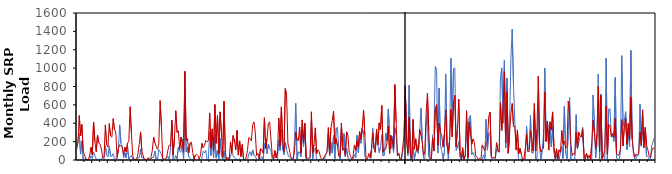
| Category | Observed (kg/month) | Baseline calibrated (kg/month) |
|---|---|---|
| 1984-01-01 | 108.048 | 135.9 |
| 1984-02-01 | 216.39 | 187 |
| 1984-03-01 | 294.928 | 484.6 |
| 1984-04-01 | 64.198 | 263.6 |
| 1984-05-01 | 207.227 | 386 |
| 1984-06-01 | 8.047 | 93.82 |
| 1984-07-01 | 5.303 | 59.36 |
| 1984-08-01 | 17.606 | 4.059 |
| 1984-09-01 | 7.118 | 3.465 |
| 1984-10-01 | 4.924 | 1.896 |
| 1984-11-01 | 4.593 | 49.46 |
| 1984-12-01 | 45.871 | 139.2 |
| 1985-01-01 | 16.212 | 55.19 |
| 1985-02-01 | 86.905 | 414 |
| 1985-03-01 | 47.809 | 199.6 |
| 1985-04-01 | 8.195 | 89.16 |
| 1985-05-01 | 8.622 | 271.1 |
| 1985-06-01 | 3.564 | 188.7 |
| 1985-07-01 | 8.514 | 166.3 |
| 1985-08-01 | 11.326 | 119.3 |
| 1985-09-01 | 9.684 | 20.19 |
| 1985-10-01 | 7.808 | 38.03 |
| 1985-11-01 | 155.088 | 381.9 |
| 1985-12-01 | 54.306 | 164.9 |
| 1986-01-01 | 32.9 | 140.7 |
| 1986-02-01 | 150.128 | 395.4 |
| 1986-03-01 | 40.3 | 261.1 |
| 1986-04-01 | 41.448 | 249.3 |
| 1986-05-01 | 69.764 | 450.2 |
| 1986-06-01 | 16.77 | 331 |
| 1986-07-01 | 23.451 | 304.3 |
| 1986-08-01 | 10.859 | 31.16 |
| 1986-09-01 | 115.216 | 125.1 |
| 1986-10-01 | 382.571 | 165.5 |
| 1986-11-01 | 177.652 | 151.8 |
| 1986-12-01 | 152.502 | 131.7 |
| 1987-01-01 | 26.45 | 60.33 |
| 1987-02-01 | 77.159 | 137.8 |
| 1987-03-01 | 21.367 | 90.11 |
| 1987-04-01 | 147.656 | 183.1 |
| 1987-05-01 | 10.481 | 204.5 |
| 1987-06-01 | 34.903 | 580.4 |
| 1987-07-01 | 48.638 | 287.4 |
| 1987-08-01 | 9.65 | 46.54 |
| 1987-09-01 | 5.763 | 5.593 |
| 1987-10-01 | 6.504 | 6.366 |
| 1987-11-01 | 4.396 | 7.368 |
| 1987-12-01 | 25.474 | 67.75 |
| 1988-01-01 | 24.74 | 170.3 |
| 1988-02-01 | 115.843 | 306.6 |
| 1988-03-01 | 25.402 | 97.17 |
| 1988-04-01 | 30.733 | 47.59 |
| 1988-05-01 | 1.336 | 3.434 |
| 1988-06-01 | 4.697 | 0.273 |
| 1988-07-01 | 4.204 | 10.87 |
| 1988-08-01 | 12.739 | 25.03 |
| 1988-09-01 | 2.21 | 5.664 |
| 1988-10-01 | 6.324 | 28.38 |
| 1988-11-01 | 29.064 | 103.4 |
| 1988-12-01 | 25.99 | 249.6 |
| 1989-01-01 | 97.28 | 185.7 |
| 1989-02-01 | 5.523 | 149.6 |
| 1989-03-01 | 8.506 | 116.2 |
| 1989-04-01 | 113.306 | 171.2 |
| 1989-05-01 | 92.401 | 646.8 |
| 1989-06-01 | 58.739 | 369.9 |
| 1989-07-01 | 11.434 | 22.36 |
| 1989-08-01 | 1.772 | 3.503 |
| 1989-09-01 | 2.798 | 14.02 |
| 1989-10-01 | 20.788 | 28.5 |
| 1989-11-01 | 38.262 | 108.4 |
| 1989-12-01 | 8.852 | 161.5 |
| 1990-01-01 | 118.282 | 152.7 |
| 1990-02-01 | 396.539 | 434.9 |
| 1990-03-01 | 11.19 | 56.69 |
| 1990-04-01 | 6.731 | 235.1 |
| 1990-05-01 | 49.139 | 536.5 |
| 1990-06-01 | 12.41 | 300.1 |
| 1990-07-01 | 137.158 | 318.5 |
| 1990-08-01 | 97.605 | 118.5 |
| 1990-09-01 | 83.53 | 250.1 |
| 1990-10-01 | 226.531 | 188.3 |
| 1990-11-01 | 6.834 | 85.06 |
| 1990-12-01 | 643.886 | 965.3 |
| 1991-01-01 | 86.483 | 207.4 |
| 1991-02-01 | 137.664 | 233.7 |
| 1991-03-01 | 29.412 | 77.04 |
| 1991-04-01 | 19.83 | 184.5 |
| 1991-05-01 | 5.333 | 194.4 |
| 1991-06-01 | 5.635 | 82.84 |
| 1991-07-01 | 3.546 | 6.62 |
| 1991-08-01 | 4.541 | 53.85 |
| 1991-09-01 | 2.308 | 62.58 |
| 1991-10-01 | 2.427 | 48.42 |
| 1991-11-01 | 1.673 | 8.192 |
| 1991-12-01 | 1.274 | 55.44 |
| 1992-01-01 | 17.896 | 181.6 |
| 1992-02-01 | 95.815 | 134 |
| 1992-03-01 | 75.682 | 157.5 |
| 1992-04-01 | 105.802 | 213.7 |
| 1992-05-01 | 4.631 | 198 |
| 1992-06-01 | 10.257 | 210.6 |
| 1992-07-01 | 309.127 | 512.9 |
| 1992-08-01 | 49.822 | 128.1 |
| 1992-09-01 | 303.124 | 338.6 |
| 1992-10-01 | 28.169 | 100.9 |
| 1992-11-01 | 275.04 | 604 |
| 1992-12-01 | 20.181 | 181.3 |
| 1993-01-01 | 106.071 | 483.4 |
| 1993-02-01 | 7.727 | 70.81 |
| 1993-03-01 | 234.616 | 524.1 |
| 1993-04-01 | 57.076 | 298.7 |
| 1993-05-01 | 0.72 | 35.48 |
| 1993-06-01 | 96.05 | 639.6 |
| 1993-07-01 | 9.66 | 86.04 |
| 1993-08-01 | 2.242 | 3.163 |
| 1993-09-01 | 1.398 | 30.03 |
| 1993-10-01 | 2.323 | 6.198 |
| 1993-11-01 | 42.304 | 197.5 |
| 1993-12-01 | 80.767 | 78.4 |
| 1994-01-01 | 48.385 | 266.1 |
| 1994-02-01 | 22.905 | 205.6 |
| 1994-03-01 | 9.444 | 109.7 |
| 1994-04-01 | 10.566 | 321.7 |
| 1994-05-01 | 0 | 52.86 |
| 1994-06-01 | 17.198 | 208.1 |
| 1994-07-01 | 2.049 | 36.93 |
| 1994-08-01 | 6.271 | 168.9 |
| 1994-09-01 | 1.894 | 2.074 |
| 1994-10-01 | 4.006 | 0.282 |
| 1994-11-01 | 2.637 | 28.34 |
| 1994-12-01 | 2.018 | 105.3 |
| 1995-01-01 | 65.525 | 243.9 |
| 1995-02-01 | 89.851 | 235.9 |
| 1995-03-01 | 44.718 | 208.2 |
| 1995-04-01 | 109.999 | 384.9 |
| 1995-05-01 | 51.345 | 415.2 |
| 1995-06-01 | 42.493 | 297.9 |
| 1995-07-01 | 7.709 | 47.29 |
| 1995-08-01 | 4.95 | 74.57 |
| 1995-09-01 | 0.82 | 1.668 |
| 1995-10-01 | 11.913 | 124 |
| 1995-11-01 | 35.714 | 109.8 |
| 1995-12-01 | 0.619 | 74.53 |
| 1996-01-01 | 179.914 | 459.6 |
| 1996-02-01 | 195.743 | 125.7 |
| 1996-03-01 | 68.605 | 235.9 |
| 1996-04-01 | 170.995 | 396.6 |
| 1996-05-01 | 125.428 | 415.3 |
| 1996-06-01 | 101.509 | 226.9 |
| 1996-07-01 | 1.794 | 54.02 |
| 1996-08-01 | 1.026 | 7.633 |
| 1996-09-01 | 0.969 | 102.2 |
| 1996-10-01 | 0.251 | 22.77 |
| 1996-11-01 | 1.953 | 88.83 |
| 1996-12-01 | 216.486 | 456.7 |
| 1997-01-01 | 103.103 | 148.6 |
| 1997-02-01 | 336.816 | 578.1 |
| 1997-03-01 | 114.536 | 205.8 |
| 1997-04-01 | 57.273 | 87.74 |
| 1997-05-01 | 194.686 | 778.1 |
| 1997-06-01 | 113.932 | 703.4 |
| 1997-07-01 | 57.085 | 174.7 |
| 1997-08-01 | 31.687 | 124.4 |
| 1997-09-01 | 24.325 | 42.2 |
| 1997-10-01 | 2.005 | 12.59 |
| 1997-11-01 | 9.142 | 12.97 |
| 1997-12-01 | 187.759 | 83.17 |
| 1998-01-01 | 617.114 | 306.4 |
| 1998-02-01 | 5.892 | 217.9 |
| 1998-03-01 | 86.87 | 211.4 |
| 1998-04-01 | 86.199 | 357.6 |
| 1998-05-01 | 35.61 | 75.91 |
| 1998-06-01 | 327.342 | 436 |
| 1998-07-01 | 145.986 | 190.6 |
| 1998-08-01 | 333.127 | 400.6 |
| 1998-09-01 | 2.341 | 26.1 |
| 1998-10-01 | 0.655 | 18.21 |
| 1998-11-01 | 1.225 | 20.77 |
| 1998-12-01 | 0.836 | 35.86 |
| 1999-01-01 | 419.578 | 525 |
| 1999-02-01 | 10.884 | 81.07 |
| 1999-03-01 | 112.747 | 169.7 |
| 1999-04-01 | 129.775 | 350 |
| 1999-05-01 | 2.535 | 67.35 |
| 1999-06-01 | 4.107 | 110.1 |
| 1999-07-01 | 8.026 | 92.87 |
| 1999-08-01 | 5.76 | 29.5 |
| 1999-09-01 | 2.939 | 6.174 |
| 1999-10-01 | 2.101 | 10.53 |
| 1999-11-01 | 2.25 | 42.46 |
| 1999-12-01 | 56.072 | 61.37 |
| 2000-01-01 | 87.264 | 89.04 |
| 2000-02-01 | 296.438 | 353.1 |
| 2000-03-01 | 43.938 | 62.79 |
| 2000-04-01 | 189.142 | 347.5 |
| 2000-05-01 | 74.512 | 430 |
| 2000-06-01 | 269.388 | 530.6 |
| 2000-07-01 | 14.505 | 176.7 |
| 2000-08-01 | 345.023 | 232.3 |
| 2000-09-01 | 355.642 | 153 |
| 2000-10-01 | 130.954 | 40.44 |
| 2000-11-01 | 4.646 | 39.55 |
| 2000-12-01 | 341.447 | 401.2 |
| 2001-01-01 | 97.799 | 114 |
| 2001-02-01 | 286.617 | 130 |
| 2001-03-01 | 37.502 | 48.57 |
| 2001-04-01 | 129.98 | 306.5 |
| 2001-05-01 | 25.652 | 268.3 |
| 2001-06-01 | 10.293 | 82.94 |
| 2001-07-01 | 3.379 | 40.16 |
| 2001-08-01 | 7.077 | 5.377 |
| 2001-09-01 | 2.654 | 43.09 |
| 2001-10-01 | 58.732 | 164.3 |
| 2001-11-01 | 25.232 | 107.2 |
| 2001-12-01 | 266.961 | 204.1 |
| 2002-01-01 | 82.396 | 148 |
| 2002-02-01 | 230.058 | 308.5 |
| 2002-03-01 | 182.048 | 225.2 |
| 2002-04-01 | 337.045 | 355.3 |
| 2002-05-01 | 292.91 | 544.7 |
| 2002-06-01 | 41.472 | 270.6 |
| 2002-07-01 | 2.936 | 4.125 |
| 2002-08-01 | 4.854 | 11.28 |
| 2002-09-01 | 5.731 | 70.55 |
| 2002-10-01 | 2.747 | 25.56 |
| 2002-11-01 | 25.732 | 109.2 |
| 2002-12-01 | 343.991 | 295.1 |
| 2003-01-01 | 131.254 | 128.3 |
| 2003-02-01 | 129.353 | 83.57 |
| 2003-03-01 | 287.804 | 334 |
| 2003-04-01 | 163.033 | 167.2 |
| 2003-05-01 | 80.265 | 404.1 |
| 2003-06-01 | 138.758 | 330.3 |
| 2003-07-01 | 274.361 | 592.6 |
| 2003-08-01 | 45.613 | 84.84 |
| 2003-09-01 | 50.596 | 117 |
| 2003-10-01 | 293.092 | 118.6 |
| 2003-11-01 | 209.705 | 186.3 |
| 2003-12-01 | 556.546 | 368.3 |
| 2004-01-01 | 290.341 | 70.95 |
| 2004-02-01 | 124.641 | 267.6 |
| 2004-03-01 | 254.19 | 207.9 |
| 2004-04-01 | 82.878 | 122.7 |
| 2004-05-01 | 350.484 | 820.8 |
| 2004-06-01 | 276.449 | 414.7 |
| 2004-07-01 | 46.086 | 47.32 |
| 2004-08-01 | 63.524 | 76.55 |
| 2004-09-01 | 3.097 | 10.22 |
| 2004-10-01 | 2.628 | 10.6 |
| 2004-11-01 | 89.18 | 134.4 |
| 2004-12-01 | 176.158 | 267.9 |
| 2005-01-01 | 753.418 | 807.2 |
| 2005-02-01 | 274.582 | 195.3 |
| 2005-03-01 | 48.433 | 75.92 |
| 2005-04-01 | 814.747 | 467.1 |
| 2005-05-01 | 5.586 | 59.03 |
| 2005-06-01 | 4.75 | 4.256 |
| 2005-07-01 | 146.586 | 441.1 |
| 2005-08-01 | 13.657 | 117.8 |
| 2005-09-01 | 80.189 | 230.9 |
| 2005-10-01 | 165.116 | 94.71 |
| 2005-11-01 | 72.857 | 109.1 |
| 2005-12-01 | 272.198 | 330.4 |
| 2006-01-01 | 564.193 | 272 |
| 2006-02-01 | 219.671 | 199.1 |
| 2006-03-01 | 20.928 | 53.64 |
| 2006-04-01 | 3.38 | 87.61 |
| 2006-05-01 | 354.306 | 514.8 |
| 2006-06-01 | 551.727 | 728.5 |
| 2006-07-01 | 43.36 | 320.9 |
| 2006-08-01 | 5.076 | 20.56 |
| 2006-09-01 | 2.96 | 16.75 |
| 2006-10-01 | 276.41 | 243.1 |
| 2006-11-01 | 291.066 | 96.9 |
| 2006-12-01 | 1016.955 | 556.8 |
| 2007-01-01 | 982.65 | 603.1 |
| 2007-02-01 | 77.711 | 159.9 |
| 2007-03-01 | 783.538 | 401.5 |
| 2007-04-01 | 155.234 | 300.7 |
| 2007-05-01 | 102.01 | 265.2 |
| 2007-06-01 | 10.898 | 139.7 |
| 2007-07-01 | 83.407 | 285.6 |
| 2007-08-01 | 936.771 | 546.1 |
| 2007-09-01 | 222.943 | 156 |
| 2007-10-01 | 7.339 | 72.15 |
| 2007-11-01 | 233.2 | 212.2 |
| 2007-12-01 | 1106.851 | 548.2 |
| 2008-01-01 | 420.581 | 252 |
| 2008-02-01 | 994.323 | 628 |
| 2008-03-01 | 1002.733 | 703.9 |
| 2008-04-01 | 103.476 | 142.6 |
| 2008-05-01 | 141.861 | 331.7 |
| 2008-06-01 | 201.143 | 662.1 |
| 2008-07-01 | 33.931 | 103 |
| 2008-08-01 | 2.884 | 3.027 |
| 2008-09-01 | 58.407 | 133.3 |
| 2008-10-01 | 3.25 | 10.74 |
| 2008-11-01 | 52.517 | 48.72 |
| 2008-12-01 | 433.378 | 536.3 |
| 2009-01-01 | 6.941 | 30.63 |
| 2009-02-01 | 455.413 | 412.2 |
| 2009-03-01 | 489.569 | 295.3 |
| 2009-04-01 | 59.773 | 170.4 |
| 2009-05-01 | 82.105 | 229.5 |
| 2009-06-01 | 46.746 | 192.8 |
| 2009-07-01 | 3.439 | 43.92 |
| 2009-08-01 | 4.269 | 32.25 |
| 2009-09-01 | 2.469 | 5.699 |
| 2009-10-01 | 3.131 | 17.43 |
| 2009-11-01 | 2.093 | 2.745 |
| 2009-12-01 | 11.942 | 164.2 |
| 2010-01-01 | 55.731 | 131.1 |
| 2010-02-01 | 2.968 | 100.9 |
| 2010-03-01 | 442.31 | 166.1 |
| 2010-04-01 | 107.638 | 203.9 |
| 2010-05-01 | 287.966 | 472.6 |
| 2010-06-01 | 302.528 | 522.2 |
| 2010-07-01 | 14.729 | 40.54 |
| 2010-08-01 | 14.105 | 20.78 |
| 2010-09-01 | 4.484 | 27.14 |
| 2010-10-01 | 4.926 | 24.54 |
| 2010-11-01 | 117.814 | 187.9 |
| 2010-12-01 | 90.645 | 102.9 |
| 2011-01-01 | 90.034 | 83.78 |
| 2011-02-01 | 897.176 | 625.5 |
| 2011-03-01 | 1003.138 | 321.6 |
| 2011-04-01 | 401.111 | 560.1 |
| 2011-05-01 | 1082.677 | 962.4 |
| 2011-06-01 | 130.043 | 184.9 |
| 2011-07-01 | 892.493 | 741.6 |
| 2011-08-01 | 70.242 | 79.31 |
| 2011-09-01 | 404.987 | 286.9 |
| 2011-10-01 | 1107.212 | 507 |
| 2011-11-01 | 1423.827 | 614.7 |
| 2011-12-01 | 808.576 | 364.2 |
| 2012-01-01 | 423.997 | 366.7 |
| 2012-02-01 | 135.269 | 107.7 |
| 2012-03-01 | 137.536 | 327.5 |
| 2012-04-01 | 2.761 | 67.32 |
| 2012-05-01 | 6.76 | 126.2 |
| 2012-06-01 | 9.333 | 61.75 |
| 2012-07-01 | 9.313 | 5.554 |
| 2012-08-01 | 5.751 | 10.79 |
| 2012-09-01 | 7.133 | 119.6 |
| 2012-10-01 | 370.468 | 275.6 |
| 2012-11-01 | 138.06 | 91.34 |
| 2012-12-01 | 119.799 | 91.13 |
| 2013-01-01 | 483.192 | 324.2 |
| 2013-02-01 | 79.624 | 232.5 |
| 2013-03-01 | 71.896 | 99.16 |
| 2013-04-01 | 512.438 | 613.7 |
| 2013-05-01 | 8.523 | 96.65 |
| 2013-06-01 | 12.122 | 335.1 |
| 2013-07-01 | 598.537 | 913.2 |
| 2013-08-01 | 132.511 | 190.1 |
| 2013-09-01 | 3.376 | 87.68 |
| 2013-10-01 | 106.902 | 112.4 |
| 2013-11-01 | 276.6 | 127.3 |
| 2013-12-01 | 1000.055 | 737.5 |
| 2014-01-01 | 200.336 | 204.9 |
| 2014-02-01 | 425.225 | 418.9 |
| 2014-03-01 | 176.173 | 107.8 |
| 2014-04-01 | 373.378 | 415.7 |
| 2014-05-01 | 141.7 | 325.7 |
| 2014-06-01 | 364.955 | 523.4 |
| 2014-07-01 | 85.646 | 148.4 |
| 2014-08-01 | 3.228 | 16.21 |
| 2014-09-01 | 50.271 | 121.6 |
| 2014-10-01 | 5.616 | 11.41 |
| 2014-11-01 | 10.043 | 110.9 |
| 2014-12-01 | 75.347 | 85.34 |
| 2015-01-01 | 153.159 | 321 |
| 2015-02-01 | 17.15 | 169.6 |
| 2015-03-01 | 584.874 | 206.9 |
| 2015-04-01 | 77.105 | 127.8 |
| 2015-05-01 | 13.039 | 139 |
| 2015-06-01 | 307.394 | 642 |
| 2015-07-01 | 678.588 | 501.8 |
| 2015-08-01 | 3.378 | 170.6 |
| 2015-09-01 | 3.947 | 45.08 |
| 2015-10-01 | 10.464 | 75.83 |
| 2015-11-01 | 6.825 | 59.38 |
| 2015-12-01 | 494.852 | 300.7 |
| 2016-01-01 | 123.581 | 132.4 |
| 2016-02-01 | 185.213 | 302.1 |
| 2016-03-01 | 254.49 | 265 |
| 2016-04-01 | 254.408 | 249.3 |
| 2016-05-01 | 354.893 | 338 |
| 2016-06-01 | 6.306 | 80.61 |
| 2016-07-01 | 5.434 | 5.556 |
| 2016-08-01 | 5.058 | 73.1 |
| 2016-09-01 | 3.491 | 14.37 |
| 2016-10-01 | 3.547 | 52.62 |
| 2016-11-01 | 4.066 | 7.159 |
| 2016-12-01 | 7.46 | 171.9 |
| 2017-01-01 | 708.287 | 432.8 |
| 2017-02-01 | 395.663 | 300.3 |
| 2017-03-01 | 22.487 | 119.6 |
| 2017-04-01 | 188.592 | 284.1 |
| 2017-05-01 | 936.189 | 802.6 |
| 2017-06-01 | 10.627 | 92.95 |
| 2017-07-01 | 717.552 | 700.9 |
| 2017-08-01 | 2.083 | 13.65 |
| 2017-09-01 | 3.382 | 47.42 |
| 2017-10-01 | 6.574 | 113.4 |
| 2017-11-01 | 1108.775 | 586.5 |
| 2017-12-01 | 4.949 | 63.95 |
| 2018-01-01 | 552.769 | 386.5 |
| 2018-02-01 | 560.075 | 370.8 |
| 2018-03-01 | 257.858 | 250.7 |
| 2018-04-01 | 259.439 | 288.7 |
| 2018-05-01 | 202.281 | 247 |
| 2018-06-01 | 898.802 | 453.9 |
| 2018-07-01 | 26.396 | 68.65 |
| 2018-08-01 | 4.211 | 52.38 |
| 2018-09-01 | 3.718 | 53.52 |
| 2018-10-01 | 82.674 | 124.4 |
| 2018-11-01 | 1135.978 | 438.8 |
| 2018-12-01 | 368.529 | 153.3 |
| 2019-01-01 | 431.157 | 371.9 |
| 2019-02-01 | 525.618 | 455.9 |
| 2019-03-01 | 113.068 | 171.3 |
| 2019-04-01 | 318.933 | 396.3 |
| 2019-05-01 | 146.669 | 220.4 |
| 2019-06-01 | 1191.635 | 686.8 |
| 2019-07-01 | 232.313 | 230.4 |
| 2019-08-01 | 69.125 | 100.6 |
| 2019-09-01 | 4.905 | 29.2 |
| 2019-10-01 | 15.813 | 65.45 |
| 2019-11-01 | 56.028 | 58.32 |
| 2019-12-01 | 48.628 | 72.84 |
| 2020-01-01 | 608.698 | 306.2 |
| 2020-02-01 | 148.94 | 163.5 |
| 2020-03-01 | 359.383 | 545.9 |
| 2020-04-01 | 226.817 | 134.7 |
| 2020-05-01 | 301.734 | 353.9 |
| 2020-06-01 | 40.584 | 161.6 |
| 2020-07-01 | 42.209 | 110.8 |
| 2020-08-01 | 6.871 | 45.62 |
| 2020-09-01 | 7.187 | 26.84 |
| 2020-10-01 | 155.37 | 99.21 |
| 2020-11-01 | 193.516 | 131 |
| 2020-12-01 | 243.785 | 123.1 |